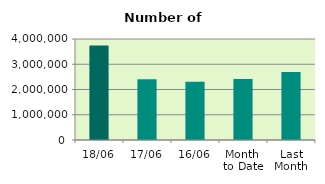
| Category | Series 0 |
|---|---|
| 18/06 | 3743478 |
| 17/06 | 2407792 |
| 16/06 | 2308928 |
| Month 
to Date | 2419476.571 |
| Last
Month | 2692139.333 |